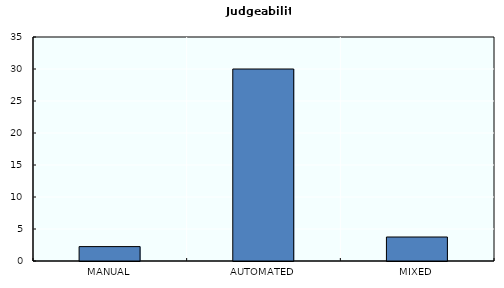
| Category | Judgeability |
|---|---|
| MANUAL | 2.25 |
| AUTOMATED | 30 |
| MIXED | 3.75 |